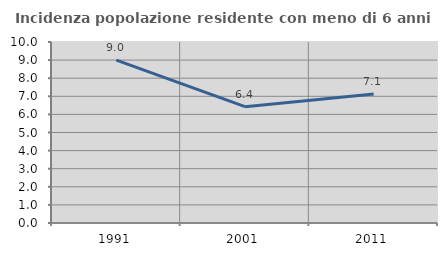
| Category | Incidenza popolazione residente con meno di 6 anni |
|---|---|
| 1991.0 | 9.001 |
| 2001.0 | 6.428 |
| 2011.0 | 7.13 |